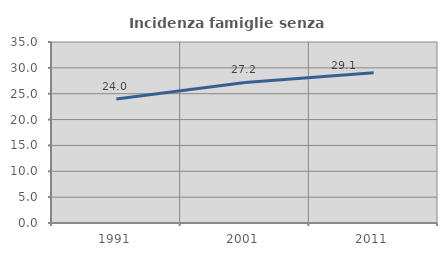
| Category | Incidenza famiglie senza nuclei |
|---|---|
| 1991.0 | 23.958 |
| 2001.0 | 27.184 |
| 2011.0 | 29.06 |